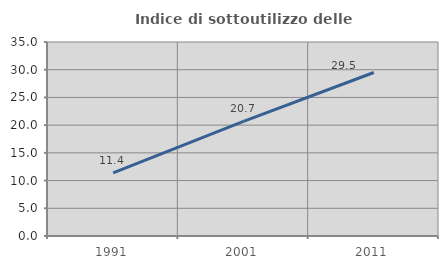
| Category | Indice di sottoutilizzo delle abitazioni  |
|---|---|
| 1991.0 | 11.381 |
| 2001.0 | 20.667 |
| 2011.0 | 29.496 |